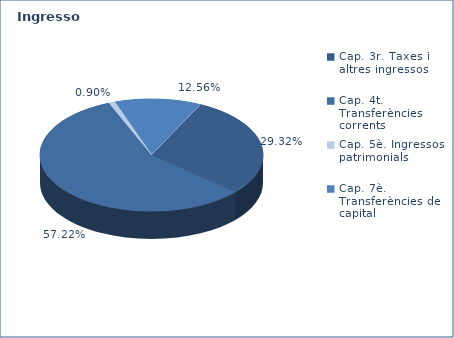
| Category | Series 0 |
|---|---|
| Cap. 3r. Taxes i altres ingressos | 80576658 |
| Cap. 4t. Transferències corrents | 157274835 |
| Cap. 5è. Ingressos patrimonials | 2487151 |
| Cap. 7è. Transferències de capital | 34509731 |
| Cap. 8è. Actius financers | 0 |
| Cap. 9è. Préstecs | 0 |